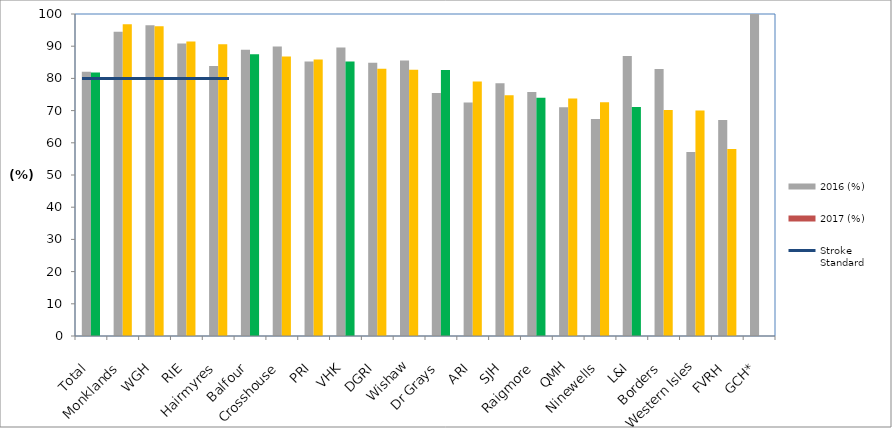
| Category | 2016 (%) | 2017 (%) |
|---|---|---|
| Total | 82.078 | 81.834 |
| Monklands | 94.521 | 96.855 |
| WGH | 96.491 | 96.205 |
| RIE | 90.833 | 91.469 |
| Hairmyres | 83.884 | 90.625 |
| Balfour | 88.889 | 87.5 |
| Crosshouse | 89.908 | 86.798 |
| PRI | 85.211 | 85.906 |
| VHK | 89.627 | 85.214 |
| DGRI | 84.884 | 82.979 |
| Wishaw | 85.556 | 82.677 |
| Dr Grays | 75.472 | 82.609 |
| ARI | 72.504 | 79.01 |
| SJH | 78.495 | 74.747 |
| Raigmore | 75.801 | 74.026 |
| QMH | 71.023 | 73.743 |
| Ninewells | 67.368 | 72.609 |
| L&I | 86.957 | 71.111 |
| Borders | 82.911 | 70.186 |
| Western Isles | 57.143 | 70 |
| FVRH | 67.073 | 58.039 |
| GCH* | 100 | 0 |